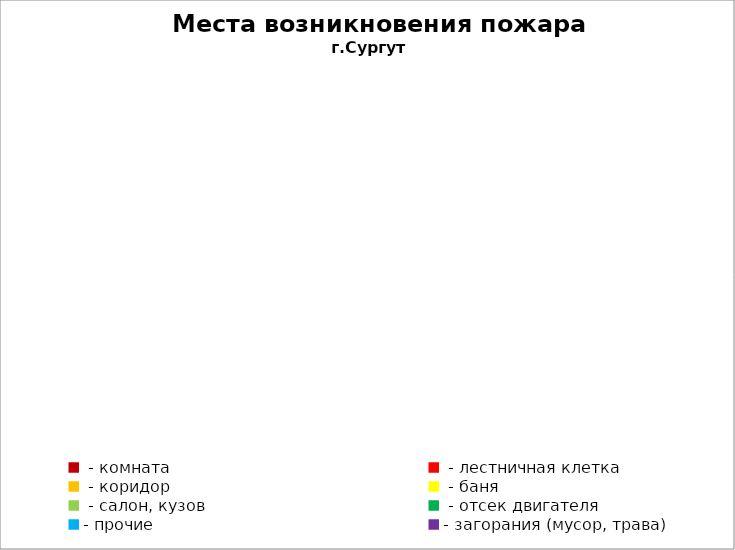
| Category | Места возникновения пожара |
|---|---|
|  - комната | 54 |
|  - лестничная клетка | 7 |
|  - коридор | 4 |
|  - баня | 24 |
|  - салон, кузов | 11 |
|  - отсек двигателя | 31 |
| - прочие | 82 |
| - загорания (мусор, трава)  | 40 |